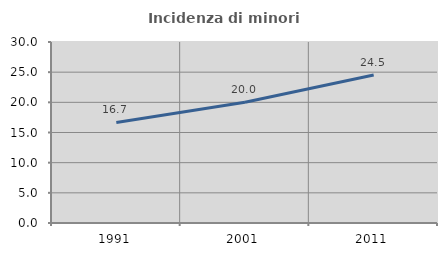
| Category | Incidenza di minori stranieri |
|---|---|
| 1991.0 | 16.667 |
| 2001.0 | 20 |
| 2011.0 | 24.528 |